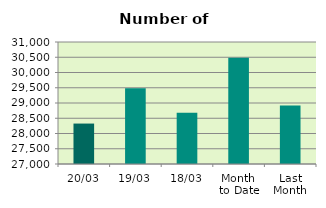
| Category | Series 0 |
|---|---|
| 20/03 | 28326 |
| 19/03 | 29480 |
| 18/03 | 28680 |
| Month 
to Date | 30487.571 |
| Last
Month | 28915.6 |